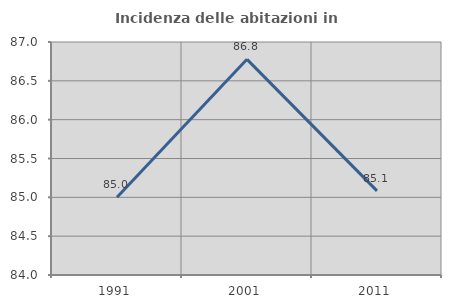
| Category | Incidenza delle abitazioni in proprietà  |
|---|---|
| 1991.0 | 85 |
| 2001.0 | 86.777 |
| 2011.0 | 85.083 |